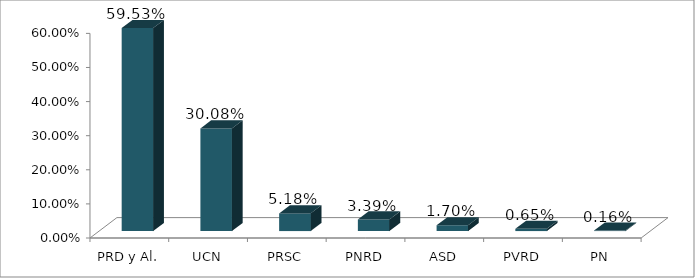
| Category | Votos % |
|---|---|
| PRD y Al. | 0.595 |
| UCN | 0.301 |
| PRSC | 0.052 |
| PNRD | 0.034 |
| ASD | 0.017 |
| PVRD | 0.007 |
| PN | 0.002 |